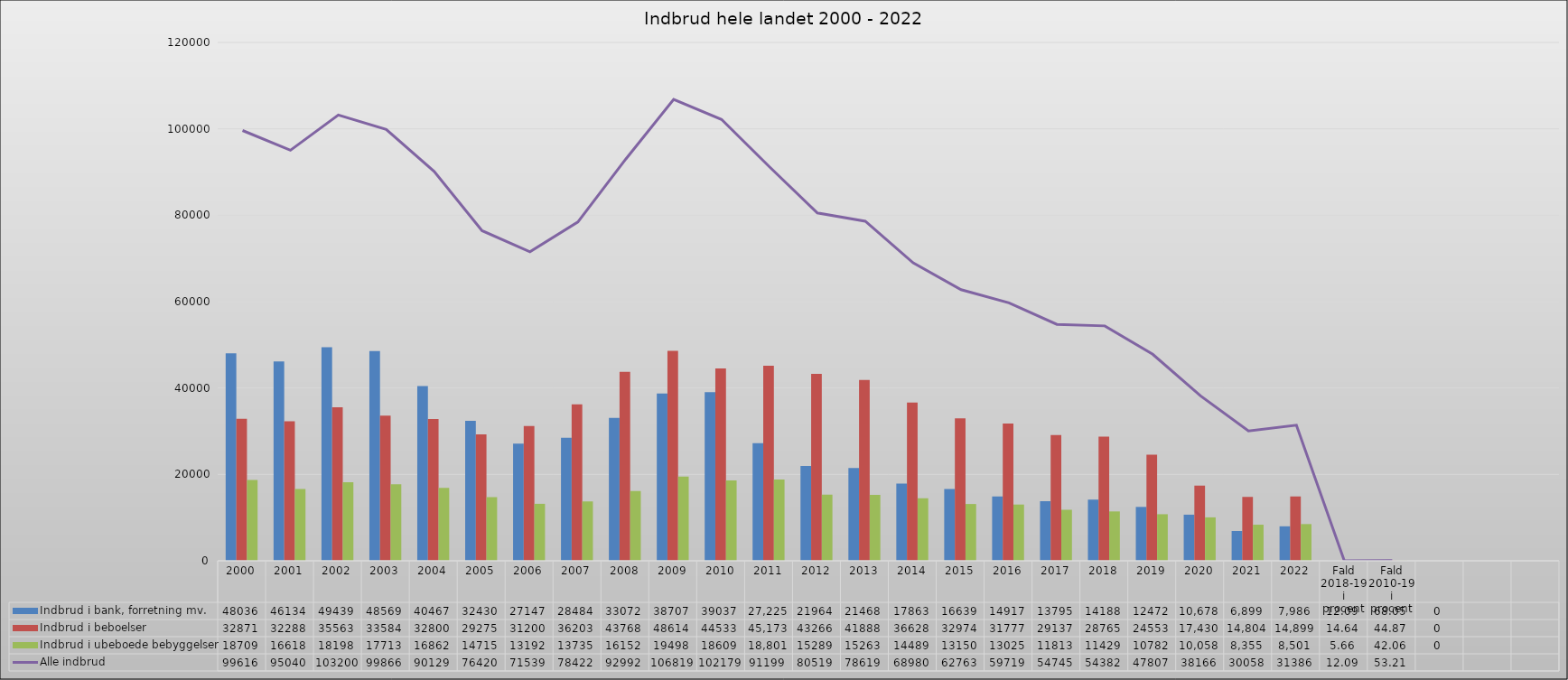
| Category | Indbrud i bank, forretning mv. | Indbrud i beboelser | Indbrud i ubeboede bebyggelser |
|---|---|---|---|
| 2000 | 48036 | 32871 | 18709 |
| 2001 | 46134 | 32288 | 16618 |
| 2002 | 49439 | 35563 | 18198 |
| 2003 | 48569 | 33584 | 17713 |
| 2004 | 40467 | 32800 | 16862 |
| 2005 | 32430 | 29275 | 14715 |
| 2006 | 27147 | 31200 | 13192 |
| 2007 | 28484 | 36203 | 13735 |
| 2008 | 33072 | 43768 | 16152 |
| 2009 | 38707 | 48614 | 19498 |
| 2010 | 39037 | 44533 | 18609 |
| 2011 | 27225 | 45173 | 18801 |
| 2012 | 21964 | 43266 | 15289 |
| 2013 | 21468 | 41888 | 15263 |
| 2014 | 17863 | 36628 | 14489 |
| 2015 | 16639 | 32974 | 13150 |
| 2016 | 14917 | 31777 | 13025 |
| 2017 | 13795 | 29137 | 11813 |
| 2018 | 14188 | 28765 | 11429 |
| 2019 | 12472 | 24553 | 10782 |
| 2020 | 10678 | 17430 | 10058 |
| 2021 | 6899 | 14804 | 8355 |
| 2022 | 7986 | 14899 | 8501 |
| Fald 2018-19 i procent | 12.095 | 14.643 | 5.661 |
| Fald 2010-19 i procent | 68.051 | 44.866 | 42.06 |